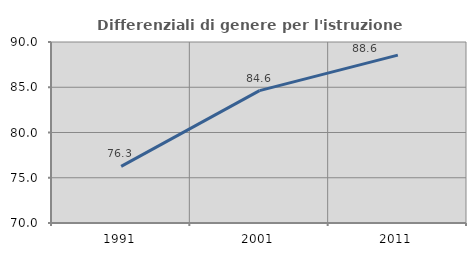
| Category | Differenziali di genere per l'istruzione superiore |
|---|---|
| 1991.0 | 76.262 |
| 2001.0 | 84.631 |
| 2011.0 | 88.551 |